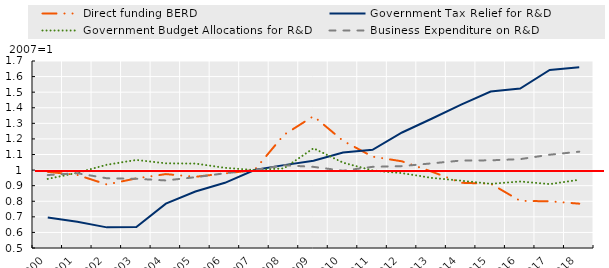
| Category | Direct funding BERD | Government Tax Relief for R&D | Government Budget Allocations for R&D | Business Expenditure on R&D  |
|---|---|---|---|---|
| 2000.0 | 0.989 | 0.696 | 0.943 | 0.968 |
| 2001.0 | 0.969 | 0.668 | 0.983 | 0.98 |
| 2002.0 | 0.908 | 0.632 | 1.034 | 0.948 |
| 2003.0 | 0.947 | 0.635 | 1.065 | 0.944 |
| 2004.0 | 0.974 | 0.785 | 1.043 | 0.933 |
| 2005.0 | 0.957 | 0.863 | 1.042 | 0.954 |
| 2006.0 | 0.979 | 0.918 | 1.014 | 0.98 |
| 2007.0 | 1 | 1 | 1 | 1 |
| 2008.0 | 1.226 | 1.032 | 1.011 | 1.031 |
| 2009.0 | 1.346 | 1.06 | 1.14 | 1.021 |
| 2010.0 | 1.188 | 1.113 | 1.048 | 0.996 |
| 2011.0 | 1.086 | 1.13 | 0.998 | 1.021 |
| 2012.0 | 1.056 | 1.241 | 0.98 | 1.025 |
| 2013.0 | 0.99 | 1.33 | 0.95 | 1.043 |
| 2014.0 | 0.918 | 1.42 | 0.932 | 1.061 |
| 2015.0 | 0.913 | 1.504 | 0.912 | 1.063 |
| 2016.0 | 0.803 | 1.523 | 0.927 | 1.07 |
| 2017.0 | 0.8 | 1.643 | 0.91 | 1.098 |
| 2018.0 | 0.784 | 1.66 | 0.938 | 1.118 |